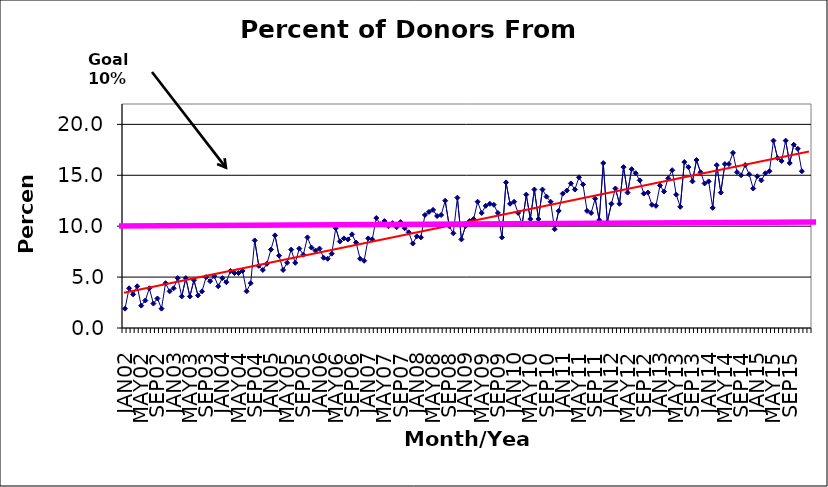
| Category | Series 0 |
|---|---|
| JAN02 | 1.9 |
| FEB02 | 3.9 |
| MAR02 | 3.3 |
| APR02 | 4.1 |
| MAY02 | 2.2 |
| JUN02 | 2.7 |
| JUL02 | 3.9 |
| AUG02 | 2.4 |
| SEP02 | 2.9 |
| OCT02 | 1.9 |
| NOV02 | 4.4 |
| DEC02 | 3.6 |
| JAN03 | 3.9 |
| FEB03 | 4.9 |
| MAR03 | 3.1 |
| APR03 | 4.9 |
| MAY03 | 3.1 |
| JUN03 | 4.7 |
| JUL03 | 3.2 |
| AUG03 | 3.6 |
| SEP03 | 5 |
| OCT03 | 4.6 |
| NOV03 | 5.1 |
| DEC03 | 4.1 |
| JAN04 | 4.9 |
| FEB04 | 4.5 |
| MAR04 | 5.6 |
| APR04 | 5.4 |
| MAY04 | 5.4 |
| JUN04 | 5.6 |
| JUL04 | 3.6 |
| AUG04 | 4.4 |
| SEP04 | 8.6 |
| OCT04 | 6.1 |
| NOV04 | 5.7 |
| DEC04 | 6.3 |
| JAN05 | 7.7 |
| FEB05 | 9.1 |
| MAR05 | 7.1 |
| APR05 | 5.7 |
| MAY05 | 6.4 |
| JUN05 | 7.7 |
| JUL05 | 6.4 |
| AUG05 | 7.8 |
| SEP05 | 7.2 |
| OCT05 | 8.9 |
| NOV05 | 7.9 |
| DEC05 | 7.6 |
| JAN06 | 7.8 |
| FEB06 | 6.9 |
| MAR06 | 6.8 |
| APR06 | 7.3 |
| MAY06 | 9.8 |
| JUN06 | 8.5 |
| JUL06 | 8.8 |
| AUG06 | 8.7 |
| SEP06 | 9.2 |
| OCT06 | 8.4 |
| NOV06 | 6.8 |
| DEC06 | 6.6 |
| JAN07 | 8.8 |
| FEB07 | 8.7 |
| MAR07 | 10.8 |
| APR07 | 10.2 |
| MAY07 | 10.5 |
| JUN07 | 10 |
| JUL07 | 10.3 |
| AUG07 | 9.9 |
| SEP07 | 10.4 |
| OCT07 | 9.8 |
| NOV07 | 9.4 |
| DEC07 | 8.3 |
| JAN08 | 9 |
| FEB08 | 8.9 |
| MAR08 | 11.1 |
| APR08 | 11.4 |
| MAY08 | 11.6 |
| JUN08 | 11 |
| JUL08 | 11.1 |
| AUG08 | 12.5 |
| SEP08 | 10 |
| OCT08 | 9.3 |
| NOV08 | 12.8 |
| DEC08 | 8.7 |
| JAN09 | 10 |
| FEB09 | 10.5 |
| MAR09 | 10.7 |
| APR09 | 12.4 |
| MAY09 | 11.3 |
| JUN09 | 12 |
| JUL09 | 12.2 |
| AUG09 | 12.1 |
| SEP09 | 11.3 |
| OCT09 | 8.9 |
| NOV09 | 14.3 |
| DEC09 | 12.2 |
| JAN10 | 12.4 |
| FEB10 | 11.3 |
| MAR10 | 10.2 |
| APR10 | 13.1 |
| MAY10 | 10.7 |
| JUN10 | 13.6 |
| JUL10 | 10.7 |
| AUG10 | 13.6 |
| SEP10 | 12.9 |
| OCT10 | 12.4 |
| NOV10 | 9.7 |
| DEC10 | 11.5 |
| JAN11 | 13.2 |
| FEB11 | 13.5 |
| MAR11 | 14.2 |
| APR11 | 13.6 |
| MAY11 | 14.8 |
| JUN11 | 14.1 |
| JUL11 | 11.5 |
| AUG11 | 11.3 |
| SEP11 | 12.7 |
| OCT11 | 10.6 |
| NOV11 | 16.2 |
| DEC11 | 10.4 |
| JAN12 | 12.2 |
| FEB12 | 13.7 |
| MAR12 | 12.2 |
| APR12 | 15.8 |
| MAY12 | 13.3 |
| JUN12 | 15.6 |
| JUL12 | 15.2 |
| AUG12 | 14.5 |
| SEP12 | 13.2 |
| OCT12 | 13.3 |
| NOV12 | 12.1 |
| DEC12 | 12 |
| JAN13 | 14 |
| FEB13 | 13.4 |
| MAR13 | 14.7 |
| APR13 | 15.5 |
| MAY13 | 13.1 |
| JUN13 | 11.9 |
| JUL13 | 16.3 |
| AUG13 | 15.8 |
| SEP13 | 14.4 |
| OCT13 | 16.5 |
| NOV13 | 15.3 |
| DEC13 | 14.2 |
| JAN14 | 14.4 |
| FEB14 | 11.8 |
| MAR14 | 16 |
| APR14 | 13.3 |
| MAY14 | 16.1 |
| JUN14 | 16.1 |
| JUL14 | 17.2 |
| AUG14 | 15.3 |
| SEP14 | 15 |
| OCT14 | 16 |
| NOV14 | 15.1 |
| DEC14 | 13.7 |
| JAN15 | 14.9 |
| FEB15 | 14.5 |
| MAR15 | 15.2 |
| APR15 | 15.4 |
| MAY15 | 18.4 |
| JUN15 | 16.7 |
| JUL15 | 16.4 |
| AUG15 | 18.4 |
| SEP15 | 16.2 |
| OCT15 | 18 |
| NOV15 | 17.6 |
| DEC15 | 15.4 |